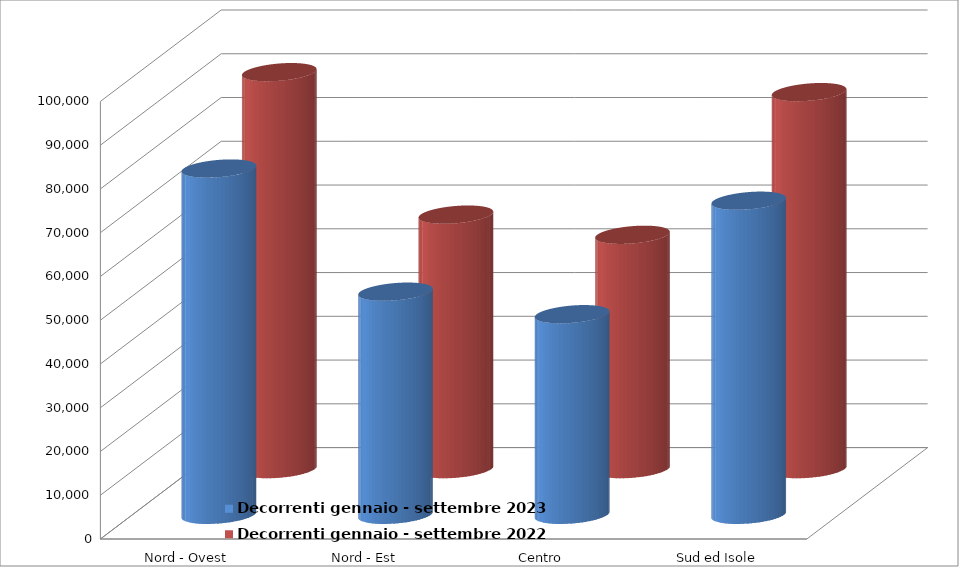
| Category | Decorrenti gennaio - settembre 2023 | Decorrenti gennaio - settembre 2022 |
|---|---|---|
| Nord - Ovest | 79146 | 90726 |
| Nord - Est | 51004 | 58170 |
| Centro | 45858 | 53559 |
| Sud ed Isole | 71790 | 86164 |